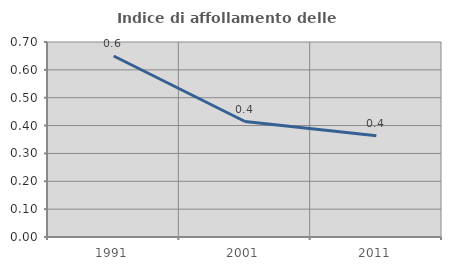
| Category | Indice di affollamento delle abitazioni  |
|---|---|
| 1991.0 | 0.65 |
| 2001.0 | 0.415 |
| 2011.0 | 0.364 |